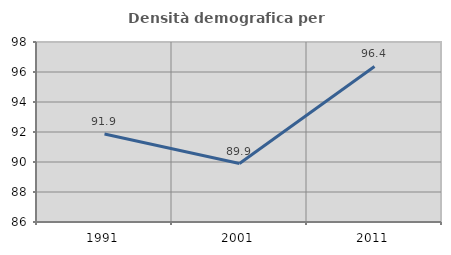
| Category | Densità demografica |
|---|---|
| 1991.0 | 91.861 |
| 2001.0 | 89.895 |
| 2011.0 | 96.372 |